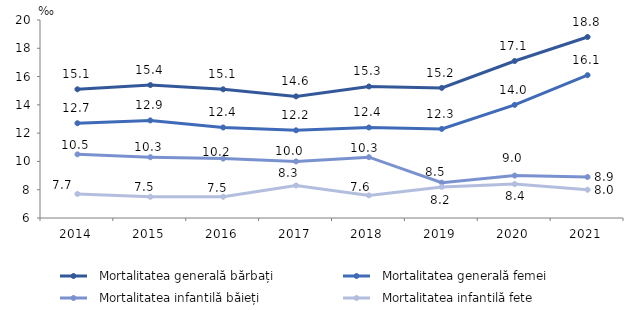
| Category | Series 0 | Series 1 | Series 2 | Series 3 |
|---|---|---|---|---|
| 2014.0 | 15.1 | 12.7 | 10.5 | 7.7 |
| 2015.0 | 15.4 | 12.9 | 10.3 | 7.5 |
| 2016.0 | 15.1 | 12.4 | 10.2 | 7.5 |
| 2017.0 | 14.6 | 12.2 | 10 | 8.3 |
| 2018.0 | 15.3 | 12.4 | 10.3 | 7.6 |
| 2019.0 | 15.2 | 12.3 | 8.5 | 8.2 |
| 2020.0 | 17.1 | 14 | 9 | 8.4 |
| 2021.0 | 18.8 | 16.1 | 8.9 | 8 |